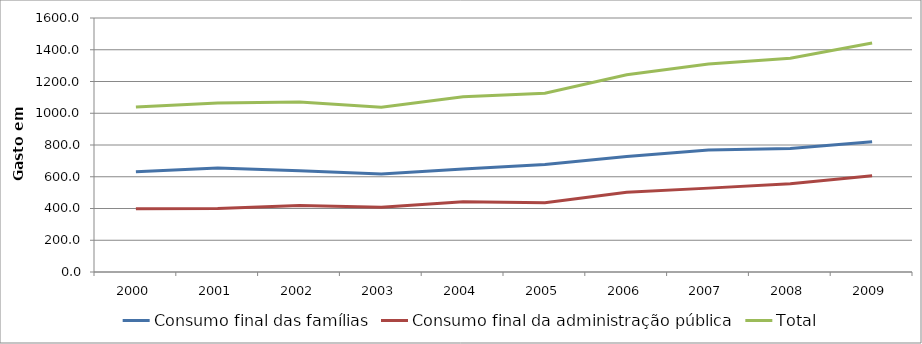
| Category | Consumo final das famílias | Consumo final da administração pública | Total |
|---|---|---|---|
| 2000.0 | 631.372 | 398.565 | 1039.25 |
| 2001.0 | 654.72 | 400.675 | 1063.92 |
| 2002.0 | 637.764 | 419.622 | 1071.02 |
| 2003.0 | 616.671 | 408.427 | 1037.19 |
| 2004.0 | 648.917 | 441.924 | 1103.54 |
| 2005.0 | 677.495 | 436.822 | 1126.35 |
| 2006.0 | 727.262 | 502.045 | 1242.21 |
| 2007.0 | 769.006 | 528.342 | 1310.78 |
| 2008.0 | 777.896 | 555.49 | 1346.96 |
| 2009.0 | 820 | 607 | 1442 |